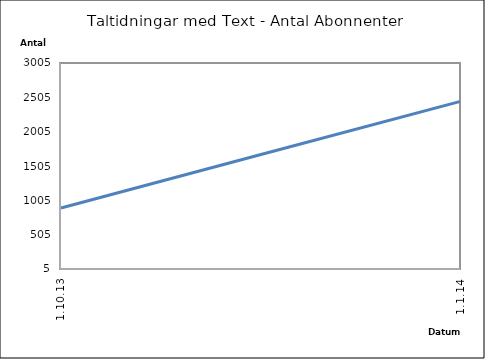
| Category | Series 0 |
|---|---|
| 1.10.13 | 894 |
| 1.1.14 | 2449 |